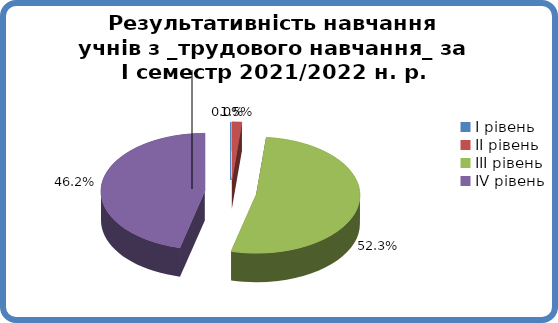
| Category | Series 0 |
|---|---|
| 0 | 0 |
| 1 | 0.015 |
| 2 | 0.523 |
| 3 | 0.462 |